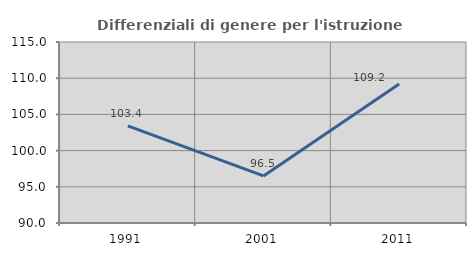
| Category | Differenziali di genere per l'istruzione superiore |
|---|---|
| 1991.0 | 103.403 |
| 2001.0 | 96.502 |
| 2011.0 | 109.189 |